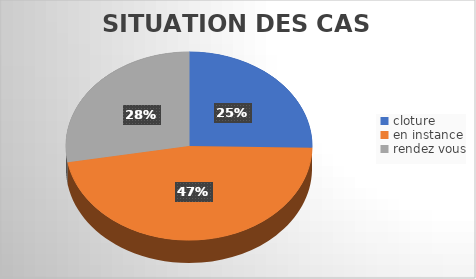
| Category | Series 0 |
|---|---|
| cloture | 1821 |
| en instance | 3378 |
| rendez vous | 1999 |